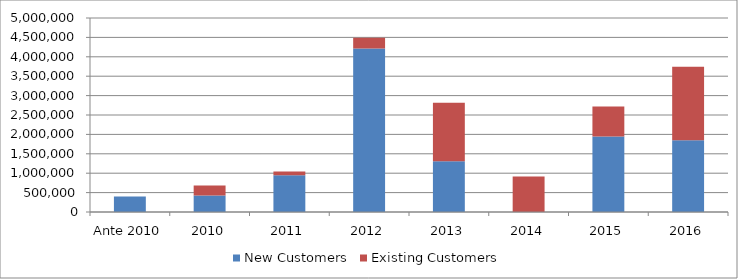
| Category | New Customers | Existing Customers |
|---|---|---|
| Ante 2010 | 400000 | 0 |
| 2010 | 425000 | 260000 |
| 2011 | 945000 | 100000 |
| 2012 | 4216500 | 272500 |
| 2013 | 1309200 | 1509416 |
| 2014 | 0 | 912621 |
| 2015 | 1947696.667 | 769000 |
| 2016 | 1848679.333 | 1892301.313 |